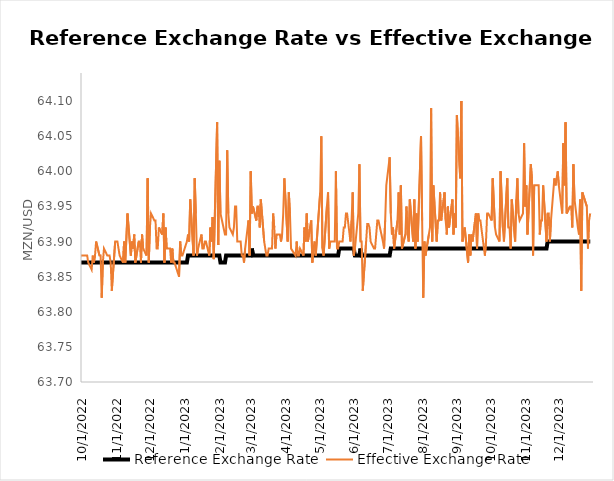
| Category | Reference Exchange Rate | Effective Exchange Rate |
|---|---|---|
| 10/1/21 | 63.83 | 63.8 |
| 10/5/21 | 63.83 | 63.83 |
| 10/6/21 | 63.83 | 63.76 |
| 10/7/21 | 63.83 | 63.82 |
| 10/8/21 | 63.83 | 63.82 |
| 10/11/21 | 63.83 | 63.77 |
| 10/12/21 | 63.83 | 63.81 |
| 10/13/21 | 63.83 | 63.82 |
| 10/14/21 | 63.83 | 63.82 |
| 10/15/21 | 63.83 | 63.82 |
| 10/18/21 | 63.83 | 63.76 |
| 10/19/21 | 63.83 | 63.76 |
| 10/20/21 | 63.83 | 63.82 |
| 10/21/21 | 63.83 | 63.78 |
| 10/22/21 | 63.83 | 63.81 |
| 10/25/21 | 63.83 | 63.82 |
| 10/26/21 | 63.83 | 63.79 |
| 10/27/21 | 63.83 | 63.8 |
| 10/28/21 | 63.83 | 63.83 |
| 10/29/21 | 63.83 | 63.82 |
| 11/1/21 | 63.83 | 63.84 |
| 11/2/21 | 63.83 | 63.81 |
| 11/3/21 | 63.83 | 63.83 |
| 11/4/21 | 63.83 | 63.82 |
| 11/5/21 | 63.83 | 63.83 |
| 11/8/21 | 63.83 | 63.79 |
| 11/9/21 | 63.83 | 63.79 |
| 11/11/21 | 63.83 | 63.84 |
| 11/12/21 | 63.83 | 63.83 |
| 11/15/21 | 63.83 | 63.78 |
| 11/16/21 | 63.83 | 63.7 |
| 11/17/21 | 63.83 | 63.84 |
| 11/18/21 | 63.83 | 63.81 |
| 11/19/21 | 63.83 | 63.8 |
| 11/22/21 | 63.83 | 63.78 |
| 11/23/21 | 63.83 | 63.81 |
| 11/24/21 | 63.83 | 63.81 |
| 11/25/21 | 63.83 | 63.81 |
| 11/26/21 | 63.83 | 63.84 |
| 11/29/21 | 63.83 | 63.8 |
| 11/30/21 | 63.83 | 63.81 |
| 12/1/21 | 63.83 | 63.79 |
| 12/2/21 | 63.83 | 63.79 |
| 12/3/21 | 63.83 | 63.82 |
| 12/6/21 | 63.83 | 63.75 |
| 12/7/21 | 63.83 | 63.78 |
| 12/8/21 | 63.83 | 63.82 |
| 12/9/21 | 63.83 | 63.82 |
| 12/10/21 | 63.83 | 63.82 |
| 12/13/21 | 63.83 | 63.83 |
| 12/14/21 | 63.83 | 63.76 |
| 12/15/21 | 63.83 | 63.82 |
| 12/16/21 | 63.83 | 63.8 |
| 12/17/21 | 63.83 | 63.79 |
| 12/20/21 | 63.83 | 63.84 |
| 12/21/21 | 63.83 | 63.79 |
| 12/22/21 | 63.83 | 63.8 |
| 12/23/21 | 63.83 | 63.82 |
| 12/27/21 | 63.83 | 63.77 |
| 12/28/21 | 63.83 | 63.74 |
| 12/29/21 | 63.83 | 63.76 |
| 12/30/21 | 63.83 | 63.78 |
| 12/31/21 | 63.83 | 63.72 |
| 1/3/22 | 63.83 | 63.79 |
| 1/4/22 | 63.83 | 63.81 |
| 1/5/22 | 63.83 | 63.8 |
| 1/6/22 | 63.83 | 63.81 |
| 1/7/22 | 63.83 | 63.77 |
| 1/10/22 | 63.83 | 63.79 |
| 1/12/22 | 63.83 | 63.83 |
| 1/13/22 | 63.83 | 63.83 |
| 1/14/22 | 63.83 | 63.83 |
| 1/17/22 | 63.83 | 63.83 |
| 1/18/22 | 63.83 | 63.83 |
| 1/19/22 | 63.83 | 63.8 |
| 1/20/22 | 63.83 | 63.83 |
| 1/21/22 | 63.83 | 63.83 |
| 1/24/22 | 63.83 | 63.81 |
| 1/25/22 | 63.83 | 63.82 |
| 1/26/22 | 63.83 | 63.83 |
| 1/27/22 | 63.83 | 63.8 |
| 1/28/22 | 63.83 | 63.83 |
| 1/31/22 | 63.83 | 63.81 |
| 2/1/22 | 63.83 | 63.83 |
| 2/2/22 | 63.83 | 63.82 |
| 2/3/22 | 63.83 | 63.78 |
| 2/4/22 | 63.83 | 63.84 |
| 2/7/22 | 63.83 | 63.83 |
| 2/8/22 | 63.83 | 63.85 |
| 2/9/22 | 63.83 | 63.8 |
| 2/10/22 | 63.83 | 63.83 |
| 2/11/22 | 63.83 | 63.83 |
| 2/14/22 | 63.83 | 63.83 |
| 2/15/22 | 63.83 | 63.81 |
| 2/16/22 | 63.83 | 63.81 |
| 2/17/22 | 63.83 | 63.83 |
| 2/18/22 | 63.83 | 63.83 |
| 2/21/22 | 63.83 | 63.84 |
| 2/22/22 | 63.83 | 63.83 |
| 2/23/22 | 63.83 | 63.83 |
| 2/24/22 | 63.83 | 63.81 |
| 2/25/22 | 63.83 | 63.82 |
| 2/28/22 | 63.83 | 63.83 |
| 3/1/22 | 63.83 | 63.79 |
| 3/2/22 | 63.83 | 63.81 |
| 3/3/22 | 63.83 | 63.83 |
| 3/4/22 | 63.83 | 63.83 |
| 3/7/22 | 63.83 | 63.82 |
| 3/8/22 | 63.83 | 63.83 |
| 3/9/22 | 63.83 | 63.76 |
| 3/10/22 | 63.83 | 63.82 |
| 3/11/22 | 63.83 | 63.83 |
| 3/14/22 | 63.83 | 63.83 |
| 3/15/22 | 63.83 | 63.82 |
| 3/16/22 | 63.83 | 63.82 |
| 3/17/22 | 63.83 | 63.82 |
| 3/18/22 | 63.83 | 63.84 |
| 3/21/22 | 63.83 | 63.8 |
| 3/22/22 | 63.83 | 63.8 |
| 3/23/22 | 63.83 | 63.82 |
| 3/24/22 | 63.83 | 63.84 |
| 3/25/22 | 63.83 | 63.83 |
| 3/28/22 | 63.83 | 63.73 |
| 3/29/22 | 63.83 | 63.88 |
| 3/30/22 | 63.83 | 63.82 |
| 3/31/22 | 63.83 | 63.84 |
| 4/1/22 | 63.83 | 63.83 |
| 4/4/22 | 63.83 | 63.83 |
| 4/5/22 | 63.83 | 63.84 |
| 4/6/22 | 63.83 | 63.83 |
| 4/8/22 | 63.83 | 63.83 |
| 4/11/22 | 63.83 | 63.83 |
| 4/12/22 | 63.83 | 63.77 |
| 4/13/22 | 63.83 | 63.83 |
| 4/14/22 | 63.83 | 63.83 |
| 4/18/22 | 63.83 | 63.83 |
| 4/19/22 | 63.83 | 63.83 |
| 4/20/22 | 63.83 | 63.84 |
| 4/21/22 | 63.83 | 63.85 |
| 4/22/22 | 63.83 | 63.83 |
| 4/25/20 | 63.83 | 63.81 |
| 4/26/22 | 63.83 | 63.83 |
| 4/27/22 | 63.83 | 63.82 |
| 4/28/22 | 63.83 | 63.83 |
| 4/29/22 | 63.83 | 63.83 |
| 5/3/22 | 63.83 | 63.83 |
| 5/4/22 | 63.83 | 63.84 |
| 5/5/22 | 63.83 | 63.82 |
| 5/6/22 | 63.83 | 63.82 |
| 5/9/22 | 63.83 | 63.82 |
| 5/10/22 | 63.83 | 63.83 |
| 5/11/22 | 63.83 | 63.83 |
| 5/12/22 | 63.83 | 63.79 |
| 5/13/22 | 63.83 | 63.83 |
| 5/16/22 | 63.83 | 63.85 |
| 5/17/22 | 63.83 | 63.82 |
| 5/18/22 | 63.83 | 63.83 |
| 5/19/22 | 63.83 | 63.83 |
| 5/20/22 | 63.83 | 63.84 |
| 5/23/22 | 63.83 | 63.84 |
| 5/24/22 | 63.83 | 63.83 |
| 5/25/22 | 63.84 | 63.79 |
| 5/26/22 | 63.84 | 63.87 |
| 5/27/22 | 63.84 | 63.91 |
| 5/30/22 | 63.84 | 63.8 |
| 5/31/22 | 63.84 | 63.84 |
| 6/1/22 | 63.84 | 63.85 |
| 6/2/22 | 63.84 | 63.84 |
| 6/3/22 | 63.84 | 63.85 |
| 6/6/22 | 63.85 | 63.86 |
| 6/7/22 | 63.85 | 63.84 |
| 6/8/22 | 63.85 | 63.85 |
| 6/9/22 | 63.85 | 63.83 |
| 6/10/22 | 63.85 | 63.85 |
| 6/13/22 | 63.85 | 63.84 |
| 6/14/22 | 63.85 | 63.85 |
| 6/15/22 | 63.85 | 63.85 |
| 6/16/22 | 63.85 | 63.85 |
| 6/17/22 | 63.85 | 63.84 |
| 6/20/22 | 63.85 | 63.82 |
| 6/21/22 | 63.86 | 63.86 |
| 6/22/22 | 63.86 | 63.83 |
| 6/23/22 | 63.86 | 63.86 |
| 6/24/22 | 63.86 | 63.86 |
| 6/27/22 | 63.86 | 63.87 |
| 6/28/22 | 63.86 | 63.85 |
| 6/29/22 | 63.86 | 63.86 |
| 6/30/22 | 63.86 | 63.83 |
| 7/1/22 | 63.86 | 63.85 |
| 7/4/22 | 63.86 | 63.86 |
| 7/5/22 | 63.86 | 63.87 |
| 7/6/22 | 63.86 | 63.87 |
| 7/7/22 | 63.86 | 63.89 |
| 7/8/22 | 63.86 | 63.86 |
| 7/11/22 | 63.86 | 63.88 |
| 7/12/22 | 63.86 | 63.87 |
| 7/13/22 | 63.86 | 63.86 |
| 7/14/22 | 63.86 | 63.86 |
| 7/15/22 | 63.86 | 63.89 |
| 7/18/22 | 63.86 | 63.94 |
| 7/19/22 | 63.86 | 63.91 |
| 7/20/22 | 63.86 | 63.87 |
| 7/21/22 | 63.86 | 63.92 |
| 7/22/22 | 63.86 | 63.84 |
| 7/25/22 | 63.87 | 63.88 |
| 7/26/22 | 63.87 | 63.89 |
| 7/27/22 | 63.87 | 63.87 |
| 7/28/22 | 63.87 | 63.87 |
| 7/29/22 | 63.87 | 63.86 |
| 8/1/22 | 63.87 | 63.83 |
| 8/2/22 | 63.87 | 63.87 |
| 8/3/22 | 63.87 | 63.89 |
| 8/4/22 | 63.87 | 63.87 |
| 8/5/22 | 63.87 | 63.87 |
| 8/8/22 | 63.87 | 63.9 |
| 8/9/22 | 63.87 | 63.87 |
| 8/10/22 | 63.87 | 63.88 |
| 8/11/22 | 63.87 | 63.88 |
| 8/12/22 | 63.87 | 63.88 |
| 8/15/22 | 63.87 | 63.87 |
| 8/16/22 | 63.87 | 63.88 |
| 8/17/22 | 63.87 | 63.89 |
| 8/18/22 | 63.87 | 63.82 |
| 8/19/22 | 63.87 | 63.88 |
| 8/22/22 | 63.87 | 63.92 |
| 8/23/22 | 63.87 | 63.87 |
| 8/24/22 | 63.87 | 63.88 |
| 8/25/22 | 63.87 | 63.87 |
| 8/26/22 | 63.87 | 63.82 |
| 8/29/22 | 63.87 | 63.89 |
| 8/30/22 | 63.87 | 63.88 |
| 9/1/22 | 63.87 | 63.92 |
| 9/2/22 | 63.87 | 63.91 |
| 9/5/22 | 63.87 | 63.88 |
| 9/6/22 | 63.87 | 63.87 |
| 9/8/22 | 63.87 | 63.89 |
| 9/9/22 | 63.87 | 63.82 |
| 9/12/22 | 63.87 | 63.89 |
| 9/13/22 | 63.87 | 63.89 |
| 9/14/22 | 63.87 | 63.88 |
| 9/15/22 | 63.87 | 63.89 |
| 9/16/22 | 63.87 | 63.91 |
| 9/19/22 | 63.87 | 63.89 |
| 9/20/22 | 63.87 | 63.89 |
| 9/21/22 | 63.87 | 63.87 |
| 9/22/22 | 63.87 | 63.91 |
| 9/23/22 | 63.87 | 63.88 |
| 9/27/22 | 63.87 | 63.87 |
| 9/28/22 | 63.87 | 63.78 |
| 9/29/22 | 63.87 | 63.87 |
| 9/30/22 | 63.87 | 63.88 |
| 10/3/22 | 63.87 | 63.88 |
| 10/5/22 | 63.87 | 63.88 |
| 10/6/22 | 63.87 | 63.88 |
| 10/7/22 | 63.87 | 63.87 |
| 10/10/22 | 63.87 | 63.86 |
| 10/11/22 | 63.87 | 63.88 |
| 10/12/22 | 63.87 | 63.87 |
| 10/13/22 | 63.87 | 63.88 |
| 10/14/22 | 63.87 | 63.9 |
| 10/17/22 | 63.87 | 63.88 |
| 10/18/22 | 63.87 | 63.88 |
| 10/19/22 | 63.87 | 63.82 |
| 10/20/22 | 63.87 | 63.87 |
| 10/21/22 | 63.87 | 63.89 |
| 10/24/22 | 63.87 | 63.88 |
| 10/25/22 | 63.87 | 63.88 |
| 10/26/22 | 63.87 | 63.88 |
| 10/27/22 | 63.87 | 63.87 |
| 10/28/22 | 63.87 | 63.83 |
| 10/31/22 | 63.87 | 63.9 |
| 11/1/22 | 63.87 | 63.9 |
| 11/2/22 | 63.87 | 63.9 |
| 11/3/22 | 63.87 | 63.89 |
| 11/4/22 | 63.87 | 63.88 |
| 11/7/22 | 63.87 | 63.87 |
| 11/8/22 | 63.87 | 63.9 |
| 11/9/22 | 63.87 | 63.87 |
| 11/11/22 | 63.87 | 63.94 |
| 11/14/22 | 63.87 | 63.88 |
| 11/15/22 | 63.87 | 63.9 |
| 11/16/22 | 63.87 | 63.89 |
| 11/17/22 | 63.87 | 63.91 |
| 11/18/22 | 63.87 | 63.87 |
| 11/21/22 | 63.87 | 63.9 |
| 11/22/22 | 63.87 | 63.9 |
| 11/23/22 | 63.87 | 63.87 |
| 11/24/22 | 63.87 | 63.91 |
| 11/25/22 | 63.87 | 63.89 |
| 11/28/22 | 63.87 | 63.88 |
| 11/29/22 | 63.87 | 63.99 |
| 11/30/22 | 63.87 | 63.87 |
| 12/1/22 | 63.87 | 63.92 |
| 12/2/22 | 63.87 | 63.94 |
| 12/5/22 | 63.87 | 63.93 |
| 12/6/22 | 63.87 | 63.93 |
| 12/7/22 | 63.87 | 63.89 |
| 12/8/22 | 63.87 | 63.89 |
| 12/9/22 | 63.87 | 63.92 |
| 12/12/22 | 63.87 | 63.91 |
| 12/13/22 | 63.87 | 63.94 |
| 12/14/22 | 63.87 | 63.87 |
| 12/15/22 | 63.87 | 63.92 |
| 12/16/22 | 63.87 | 63.89 |
| 12/19/22 | 63.87 | 63.89 |
| 12/20/22 | 63.87 | 63.87 |
| 12/21/22 | 63.87 | 63.89 |
| 12/22/22 | 63.87 | 63.87 |
| 12/23/22 | 63.87 | 63.87 |
| 12/27/22 | 63.87 | 63.85 |
| 12/28/22 | 63.87 | 63.9 |
| 12/29/22 | 63.87 | 63.88 |
| 12/30/22 | 63.87 | 63.88 |
| 1/3/23 | 63.87 | 63.9 |
| 1/4/23 | 63.88 | 63.91 |
| 1/5/23 | 63.88 | 63.9 |
| 1/6/23 | 63.88 | 63.96 |
| 1/9/23 | 63.88 | 63.88 |
| 1/10/23 | 63.88 | 63.99 |
| 1/11/23 | 63.88 | 63.94 |
| 1/12/23 | 63.88 | 63.88 |
| 1/13/23 | 63.88 | 63.89 |
| 1/16/23 | 63.88 | 63.91 |
| 1/17/23 | 63.88 | 63.89 |
| 1/18/23 | 63.88 | 63.89 |
| 1/19/23 | 63.88 | 63.9 |
| 1/20/23 | 63.88 | 63.9 |
| 1/23/23 | 63.88 | 63.88 |
| 1/24/23 | 63.88 | 63.92 |
| 1/25/23 | 63.88 | 63.9 |
| 1/26/23 | 63.88 | 63.935 |
| 1/27/23 | 63.88 | 63.875 |
| 1/30/23 | 63.88 | 64.07 |
| 1/31/23 | 63.88 | 63.895 |
| 2/1/23 | 63.88 | 64.015 |
| 2/2/23 | 63.87 | 63.94 |
| 2/6/23 | 63.87 | 63.91 |
| 2/7/23 | 63.88 | 63.91 |
| 2/8/23 | 63.88 | 64.03 |
| 2/9/23 | 63.88 | 63.94 |
| 2/10/23 | 63.88 | 63.92 |
| 2/13/23 | 63.88 | 63.91 |
| 2/14/23 | 63.88 | 63.92 |
| 2/15/23 | 63.88 | 63.95 |
| 2/16/23 | 63.88 | 63.95 |
| 2/17/23 | 63.88 | 63.9 |
| 2/20/23 | 63.88 | 63.9 |
| 2/21/23 | 63.88 | 63.88 |
| 2/22/23 | 63.88 | 63.88 |
| 2/23/23 | 63.88 | 63.87 |
| 2/24/23 | 63.88 | 63.89 |
| 2/27/23 | 63.88 | 63.93 |
| 2/28/23 | 63.88 | 63.88 |
| 3/1/23 | 63.88 | 64 |
| 3/2/23 | 63.89 | 63.94 |
| 3/3/23 | 63.88 | 63.95 |
| 3/6/23 | 63.88 | 63.93 |
| 3/7/23 | 63.88 | 63.95 |
| 3/8/23 | 63.88 | 63.95 |
| 3/9/23 | 63.88 | 63.92 |
| 3/10/23 | 63.88 | 63.96 |
| 3/13/23 | 63.88 | 63.9 |
| 3/14/23 | 63.88 | 63.89 |
| 3/15/23 | 63.88 | 63.88 |
| 3/16/23 | 63.88 | 63.88 |
| 3/17/23 | 63.88 | 63.89 |
| 3/20/23 | 63.88 | 63.89 |
| 3/21/23 | 63.88 | 63.94 |
| 3/22/23 | 63.88 | 63.92 |
| 3/23/23 | 63.88 | 63.89 |
| 3/24/23 | 63.88 | 63.91 |
| 3/27/23 | 63.88 | 63.91 |
| 3/28/23 | 63.88 | 63.9 |
| 3/29/23 | 63.88 | 63.91 |
| 3/30/23 | 63.88 | 63.94 |
| 3/31/23 | 63.88 | 63.99 |
| 4/3/23 | 63.88 | 63.9 |
| 4/4/23 | 63.88 | 63.97 |
| 4/5/23 | 63.88 | 63.94 |
| 4/6/23 | 63.88 | 63.89 |
| 4/10/23 | 63.88 | 63.88 |
| 4/11/23 | 63.88 | 63.9 |
| 4/12/23 | 63.88 | 63.88 |
| 4/13/23 | 63.88 | 63.88 |
| 4/14/23 | 63.88 | 63.89 |
| 4/17/23 | 63.88 | 63.88 |
| 4/18/23 | 63.88 | 63.92 |
| 4/19/23 | 63.88 | 63.9 |
| 4/20/23 | 63.88 | 63.94 |
| 4/21/23 | 63.88 | 63.9 |
| 4/24/23 | 63.88 | 63.93 |
| 4/25/23 | 63.88 | 63.87 |
| 4/26/23 | 63.88 | 63.89 |
| 4/27/23 | 63.88 | 63.9 |
| 4/28/23 | 63.88 | 63.88 |
| 5/2/23 | 63.88 | 63.97 |
| 5/3/23 | 63.88 | 64.05 |
| 5/4/23 | 63.88 | 63.89 |
| 5/5/23 | 63.88 | 63.88 |
| 5/8/23 | 63.88 | 63.95 |
| 5/9/23 | 63.88 | 63.97 |
| 5/10/23 | 63.88 | 63.89 |
| 5/11/23 | 63.88 | 63.9 |
| 5/12/23 | 63.88 | 63.9 |
| 5/15/23 | 63.88 | 63.9 |
| 5/16/23 | 63.88 | 64 |
| 5/17/23 | 63.88 | 63.89 |
| 5/18/23 | 63.88 | 63.89 |
| 5/19/23 | 63.89 | 63.9 |
| 5/22/23 | 63.89 | 63.9 |
| 5/23/23 | 63.89 | 63.92 |
| 5/24/23 | 63.89 | 63.92 |
| 5/25/23 | 63.89 | 63.94 |
| 5/26/23 | 63.89 | 63.94 |
| 5/29/23 | 63.89 | 63.9 |
| 5/30/23 | 63.89 | 63.93 |
| 5/31/23 | 63.89 | 63.97 |
| 6/1/23 | 63.89 | 63.88 |
| 6/2/23 | 63.88 | 63.89 |
| 6/5/23 | 63.88 | 63.94 |
| 6/6/23 | 63.88 | 64.01 |
| 6/7/23 | 63.89 | 63.9 |
| 6/8/23 | 63.88 | 63.9 |
| 6/9/23 | 63.88 | 63.83 |
| 6/12/23 | 63.88 | 63.9 |
| 6/13/23 | 63.88 | 63.925 |
| 6/14/23 | 63.88 | 63.925 |
| 6/15/23 | 63.88 | 63.92 |
| 6/16/23 | 63.88 | 63.9 |
| 6/19/23 | 63.88 | 63.89 |
| 6/20/23 | 63.88 | 63.89 |
| 6/21/23 | 63.88 | 63.91 |
| 6/22/23 | 63.88 | 63.93 |
| 6/23/23 | 63.88 | 63.93 |
| 6/27/23 | 63.88 | 63.9 |
| 6/28/23 | 63.88 | 63.89 |
| 6/29/23 | 63.88 | 63.93 |
| 6/30/23 | 63.88 | 63.98 |
| 7/3/23 | 63.88 | 64.02 |
| 7/4/23 | 63.89 | 63.94 |
| 7/5/23 | 63.89 | 63.91 |
| 7/6/23 | 63.89 | 63.92 |
| 7/7/23 | 63.89 | 63.89 |
| 7/10/23 | 63.89 | 63.93 |
| 7/11/23 | 63.89 | 63.97 |
| 7/12/23 | 63.89 | 63.91 |
| 7/13/23 | 63.89 | 63.98 |
| 7/14/23 | 63.89 | 63.89 |
| 7/17/23 | 63.89 | 63.91 |
| 7/18/23 | 63.89 | 63.95 |
| 7/19/23 | 63.89 | 63.91 |
| 7/20/23 | 63.89 | 63.9 |
| 7/21/23 | 63.89 | 63.96 |
| 7/24/23 | 63.89 | 63.9 |
| 7/25/23 | 63.89 | 63.96 |
| 7/26/23 | 63.89 | 63.89 |
| 7/27/23 | 63.89 | 63.94 |
| 7/28/23 | 63.89 | 63.9 |
| 7/31/23 | 63.89 | 64.05 |
| 8/1/23 | 63.89 | 63.93 |
| 8/2/23 | 63.89 | 63.82 |
| 8/3/23 | 63.89 | 63.9 |
| 8/4/23 | 63.89 | 63.88 |
| 8/7/23 | 63.89 | 63.91 |
| 8/8/23 | 63.89 | 63.92 |
| 8/9/23 | 63.89 | 64.09 |
| 8/10/23 | 63.89 | 63.9 |
| 8/11/23 | 63.89 | 63.98 |
| 8/14/23 | 63.89 | 63.9 |
| 8/15/23 | 63.89 | 63.93 |
| 8/16/23 | 63.89 | 63.93 |
| 8/17/23 | 63.89 | 63.97 |
| 8/18/23 | 63.89 | 63.93 |
| 8/21/23 | 63.89 | 63.97 |
| 8/22/23 | 63.89 | 63.93 |
| 8/23/23 | 63.89 | 63.91 |
| 8/24/23 | 63.89 | 63.95 |
| 8/25/23 | 63.89 | 63.92 |
| 8/28/23 | 63.89 | 63.96 |
| 8/29/23 | 63.89 | 63.91 |
| 8/30/23 | 63.89 | 63.94 |
| 8/31/23 | 63.89 | 63.92 |
| 9/1/23 | 63.89 | 64.08 |
| 9/4/23 | 63.89 | 63.99 |
| 9/5/23 | 63.89 | 64.1 |
| 9/6/23 | 63.89 | 63.9 |
| 9/8/23 | 63.89 | 63.92 |
| 9/11/23 | 63.89 | 63.87 |
| 9/12/23 | 63.89 | 63.91 |
| 9/13/23 | 63.89 | 63.88 |
| 9/14/23 | 63.89 | 63.91 |
| 9/15/23 | 63.89 | 63.9 |
| 9/18/23 | 63.89 | 63.94 |
| 9/19/23 | 63.89 | 63.89 |
| 9/20/23 | 63.89 | 63.94 |
| 9/21/23 | 63.89 | 63.93 |
| 9/22/23 | 63.89 | 63.93 |
| 9/26/23 | 63.89 | 63.88 |
| 9/27/23 | 63.89 | 63.9 |
| 9/28/23 | 63.89 | 63.94 |
| 9/29/23 | 63.89 | 63.94 |
| 10/2/23 | 63.89 | 63.93 |
| 10/3/23 | 63.89 | 63.99 |
| 10/5/23 | 63.89 | 63.92 |
| 10/6/23 | 63.89 | 63.91 |
| 10/9/23 | 63.89 | 63.9 |
| 10/10/23 | 63.89 | 64 |
| 10/12/23 | 63.89 | 63.92 |
| 10/13/23 | 63.89 | 63.9 |
| 10/16/23 | 63.89 | 63.99 |
| 10/17/23 | 63.89 | 63.92 |
| 10/18/23 | 63.89 | 63.92 |
| 10/19/23 | 63.89 | 63.89 |
| 10/20/23 | 63.89 | 63.96 |
| 10/23/23 | 63.89 | 63.9 |
| 10/24/23 | 63.89 | 63.96 |
| 10/25/23 | 63.89 | 63.99 |
| 10/26/23 | 63.89 | 63.94 |
| 10/27/23 | 63.89 | 63.93 |
| 10/30/23 | 63.89 | 63.94 |
| 10/31/23 | 63.89 | 64.04 |
| 11/1/23 | 63.89 | 63.95 |
| 11/2/23 | 63.89 | 63.98 |
| 11/3/23 | 63.89 | 63.91 |
| 11/6/23 | 63.89 | 64.01 |
| 11/7/23 | 63.89 | 63.99 |
| 11/8/23 | 63.89 | 63.88 |
| 11/9/23 | 63.89 | 63.98 |
| 11/13/23 | 63.89 | 63.98 |
| 11/14/23 | 63.89 | 63.91 |
| 11/15/23 | 63.89 | 63.93 |
| 11/16/23 | 63.89 | 63.93 |
| 11/17/23 | 63.89 | 63.98 |
| 11/20/23 | 63.89 | 63.9 |
| 11/21/23 | 63.9 | 63.94 |
| 11/22/23 | 63.9 | 63.94 |
| 11/23/23 | 63.9 | 63.9 |
| 11/24/23 | 63.9 | 63.93 |
| 11/27/23 | 63.9 | 63.99 |
| 11/28/23 | 63.9 | 63.98 |
| 11/29/23 | 63.9 | 63.99 |
| 11/30/23 | 63.9 | 64 |
| 12/1/23 | 63.9 | 63.98 |
| 12/4/23 | 63.9 | 63.94 |
| 12/5/23 | 63.9 | 64.04 |
| 12/6/23 | 63.9 | 63.98 |
| 12/7/23 | 63.9 | 64.07 |
| 12/8/23 | 63.9 | 63.94 |
| 12/11/23 | 63.9 | 63.95 |
| 12/12/23 | 63.9 | 63.95 |
| 12/13/23 | 63.9 | 63.92 |
| 12/14/23 | 63.9 | 64.01 |
| 12/15/23 | 63.9 | 63.96 |
| 12/18/23 | 63.9 | 63.92 |
| 12/19/23 | 63.9 | 63.91 |
| 12/20/23 | 63.9 | 63.96 |
| 12/21/23 | 63.9 | 63.83 |
| 12/22/23 | 63.9 | 63.97 |
| 12/26/23 | 63.9 | 63.95 |
| 12/27/23 | 63.9 | 63.89 |
| 12/28/23 | 63.9 | 63.93 |
| 12/29/23 | 63.9 | 63.94 |